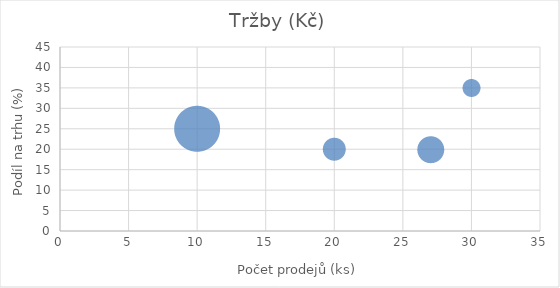
| Category | Tržby (Kč) |
|---|---|
| 10.0 | 25 |
| 20.0 | 20 |
| 30.0 | 35 |
| 27.0 | 20 |